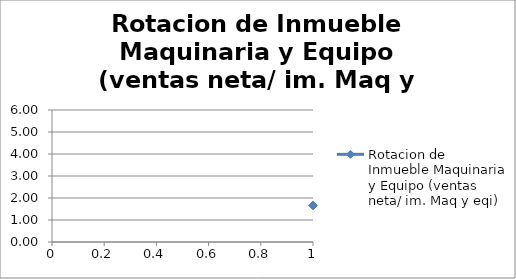
| Category | Rotacion de Inmueble Maquinaria y Equipo (ventas neta/ im. Maq y eqi) |
|---|---|
| 0 | 1.662 |
| 1 | 3.804 |
| 2 | 3.456 |
| 3 | 3.989 |
| 4 | 2.832 |
| 5 | 5.015 |
| 6 | 4.136 |
| 7 | 4.664 |